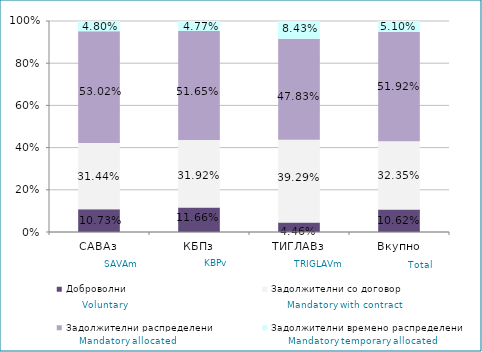
| Category | Доброволни  | Задолжителни со договор  | Задолжителни распределени  | Задолжителни времено распределени  |
|---|---|---|---|---|
| САВАз | 0.107 | 0.314 | 0.53 | 0.048 |
| КБПз | 0.117 | 0.319 | 0.516 | 0.048 |
| ТИГЛАВз | 0.045 | 0.393 | 0.478 | 0.084 |
| Вкупно | 0.106 | 0.324 | 0.519 | 0.051 |